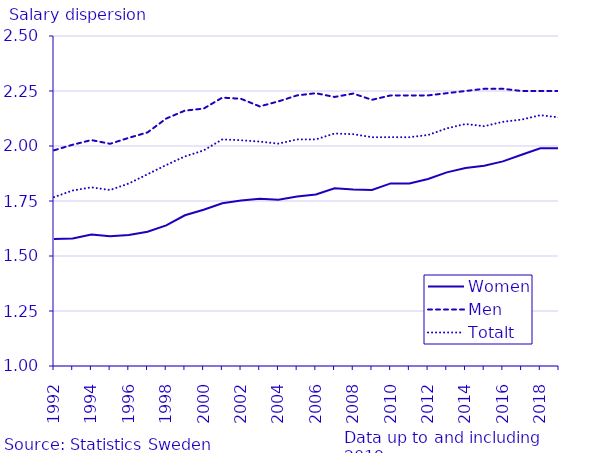
| Category | Women | Men | Totalt |
|---|---|---|---|
| 1992.0 | 1.578 | 1.98 | 1.768 |
| 1993.0 | 1.58 | 2.006 | 1.798 |
| 1994.0 | 1.598 | 2.027 | 1.812 |
| 1995.0 | 1.59 | 2.01 | 1.8 |
| 1996.0 | 1.596 | 2.037 | 1.83 |
| 1997.0 | 1.61 | 2.062 | 1.871 |
| 1998.0 | 1.639 | 2.125 | 1.914 |
| 1999.0 | 1.685 | 2.161 | 1.953 |
| 2000.0 | 1.71 | 2.17 | 1.98 |
| 2001.0 | 1.74 | 2.22 | 2.03 |
| 2002.0 | 1.752 | 2.214 | 2.026 |
| 2003.0 | 1.76 | 2.18 | 2.02 |
| 2004.0 | 1.756 | 2.203 | 2.011 |
| 2005.0 | 1.77 | 2.23 | 2.03 |
| 2006.0 | 1.78 | 2.24 | 2.03 |
| 2007.0 | 1.808 | 2.223 | 2.057 |
| 2008.0 | 1.802 | 2.238 | 2.054 |
| 2009.0 | 1.8 | 2.21 | 2.04 |
| 2010.0 | 1.83 | 2.23 | 2.04 |
| 2011.0 | 1.83 | 2.23 | 2.04 |
| 2012.0 | 1.85 | 2.23 | 2.05 |
| 2013.0 | 1.88 | 2.24 | 2.08 |
| 2014.0 | 1.9 | 2.25 | 2.1 |
| 2015.0 | 1.91 | 2.26 | 2.09 |
| 2016.0 | 1.93 | 2.26 | 2.11 |
| 2017.0 | 1.96 | 2.25 | 2.12 |
| 2018.0 | 1.99 | 2.25 | 2.14 |
| 2019.0 | 1.99 | 2.25 | 2.13 |